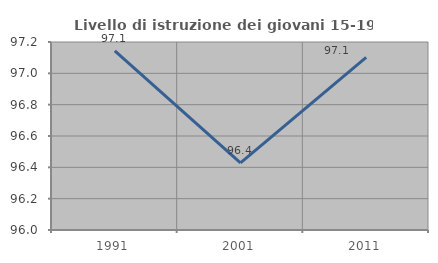
| Category | Livello di istruzione dei giovani 15-19 anni |
|---|---|
| 1991.0 | 97.143 |
| 2001.0 | 96.429 |
| 2011.0 | 97.101 |